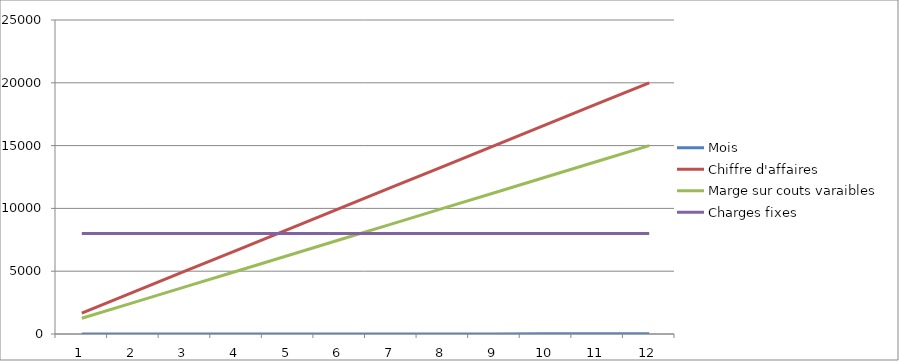
| Category | Mois | Chiffre d'affaires | Marge sur couts varaibles | Charges fixes |
|---|---|---|---|---|
| 0 | 1 | 1666.667 | 1250 | 8000 |
| 1 | 2 | 3333.333 | 2500 | 8000 |
| 2 | 3 | 5000 | 3750 | 8000 |
| 3 | 4 | 6666.667 | 5000 | 8000 |
| 4 | 5 | 8333.333 | 6250 | 8000 |
| 5 | 6 | 10000 | 7500 | 8000 |
| 6 | 7 | 11666.667 | 8750 | 8000 |
| 7 | 8 | 13333.333 | 10000 | 8000 |
| 8 | 9 | 15000 | 11250 | 8000 |
| 9 | 10 | 16666.667 | 12500 | 8000 |
| 10 | 11 | 18333.333 | 13750 | 8000 |
| 11 | 12 | 20000 | 15000 | 8000 |